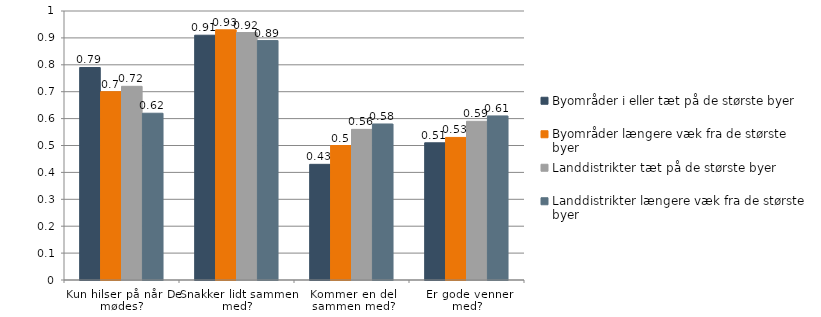
| Category | Byområder i eller tæt på de største byer | Byområder længere væk fra de største byer | Landdistrikter tæt på de største byer | Landdistrikter længere væk fra de største byer |
|---|---|---|---|---|
| Kun hilser på når De mødes? | 0.79 | 0.7 | 0.72 | 0.62 |
| Snakker lidt sammen med? | 0.91 | 0.93 | 0.92 | 0.89 |
| Kommer en del sammen med? | 0.43 | 0.5 | 0.56 | 0.58 |
| Er gode venner med? | 0.51 | 0.53 | 0.59 | 0.61 |